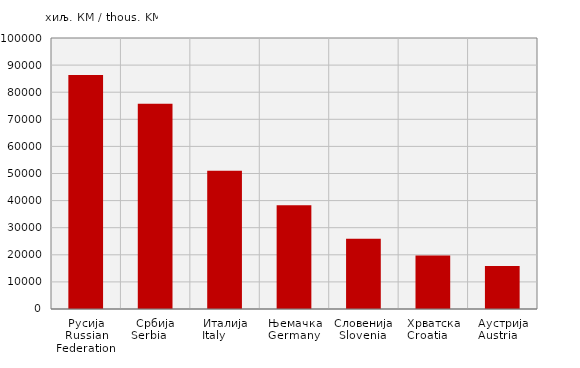
| Category | Увоз
Import |
|---|---|
| Русија
Russian Federation  | 86349 |
| Србија
Serbia     | 75779 |
| Италија
Italy        | 51058 |
| Њемачка
Germany  | 38281 |
| Словенија
Slovenia  | 25951 |
| Хрватска
Croatia     | 19784 |
| Аустрија
Austria    | 15823 |